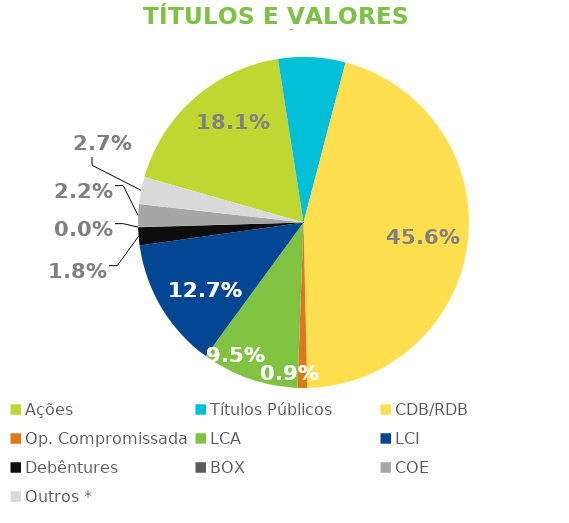
| Category | TVM |
|---|---|
| Ações | 0.181 |
| Títulos Públicos | 0.065 |
| CDB/RDB | 0.456 |
| Op. Compromissada | 0.009 |
| LCA | 0.095 |
| LCI | 0.127 |
| Debêntures | 0.018 |
| BOX | 0 |
| COE | 0.022 |
| Outros * | 0.027 |